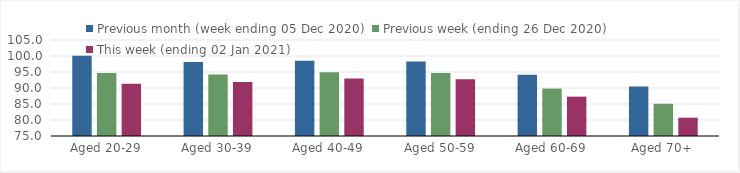
| Category | Previous month (week ending 05 Dec 2020) | Previous week (ending 26 Dec 2020) | This week (ending 02 Jan 2021) |
|---|---|---|---|
| Aged 20-29 | 100.04 | 94.69 | 91.34 |
| Aged 30-39 | 98.16 | 94.23 | 91.89 |
| Aged 40-49 | 98.49 | 94.93 | 92.93 |
| Aged 50-59 | 98.26 | 94.65 | 92.7 |
| Aged 60-69 | 94.15 | 89.82 | 87.3 |
| Aged 70+ | 90.45 | 85.07 | 80.72 |